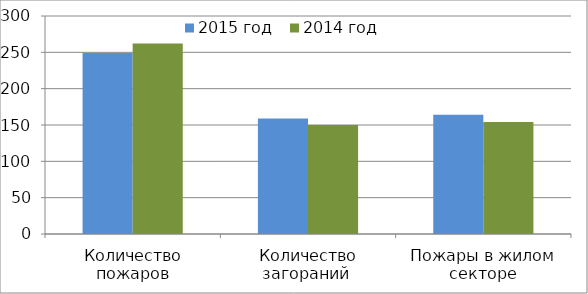
| Category | 2015 год | 2014 год |
|---|---|---|
| Количество пожаров | 249 | 262 |
| Количество загораний  | 159 | 150 |
| Пожары в жилом секторе | 164 | 154 |